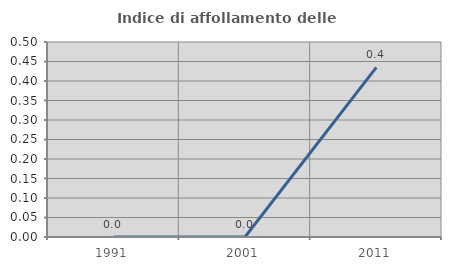
| Category | Indice di affollamento delle abitazioni  |
|---|---|
| 1991.0 | 0 |
| 2001.0 | 0 |
| 2011.0 | 0.435 |